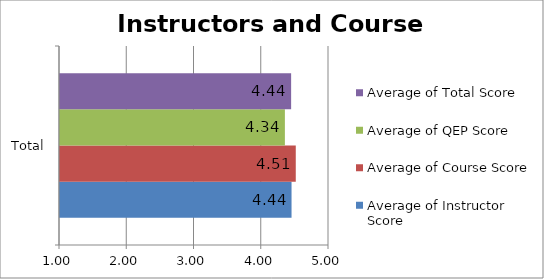
| Category | Average of Instructor Score | Average of Course Score | Average of QEP Score | Average of Total Score |
|---|---|---|---|---|
| Total | 4.443 | 4.506 | 4.344 | 4.437 |